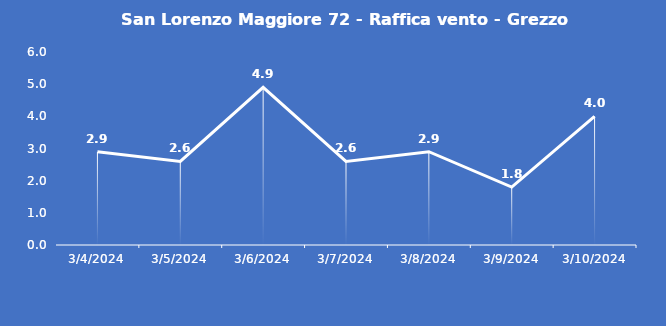
| Category | San Lorenzo Maggiore 72 - Raffica vento - Grezzo (m/s) |
|---|---|
| 3/4/24 | 2.9 |
| 3/5/24 | 2.6 |
| 3/6/24 | 4.9 |
| 3/7/24 | 2.6 |
| 3/8/24 | 2.9 |
| 3/9/24 | 1.8 |
| 3/10/24 | 4 |